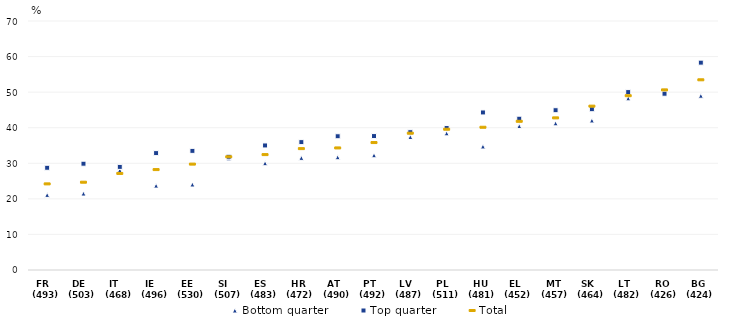
| Category | Bottom quarter | Top quarter | Total |
|---|---|---|---|
| FR   (493) | 21.11 | 28.74 | 24.21 |
| DE   (503) | 21.49 | 29.88 | 24.68 |
| IT    (468) | 28.03 | 28.99 | 27.147 |
| IE    (496) | 23.72 | 32.86 | 28.231 |
| EE   (530) | 24.04 | 33.49 | 29.768 |
| SI    (507) | 31.39 | 31.83 | 31.827 |
| ES   (483) | 30.02 | 35.01 | 32.441 |
| HR  (472) | 31.52 | 35.95 | 34.125 |
| AT   (490) | 31.7 | 37.6 | 34.318 |
| PT   (492) | 32.26 | 37.65 | 35.826 |
| LV   (487) | 37.39 | 38.74 | 38.46 |
| PL   (511) | 38.42 | 39.91 | 39.574 |
| HU  (481) | 34.73 | 44.29 | 40.127 |
| EL   (452) | 40.46 | 42.53 | 41.8 |
| MT  (457) | 41.23 | 44.92 | 42.769 |
| SK   (464) | 42.04 | 45.2 | 46.062 |
| LT   (482) | 48.26 | 50.01 | 49.002 |
| RO  (426) | 50.4 | 49.55 | 50.636 |
| BG  (424) | 48.99 | 58.29 | 53.47 |